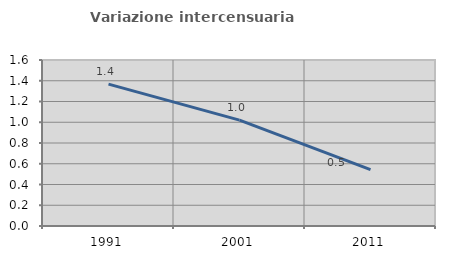
| Category | Variazione intercensuaria annua |
|---|---|
| 1991.0 | 1.368 |
| 2001.0 | 1.021 |
| 2011.0 | 0.543 |